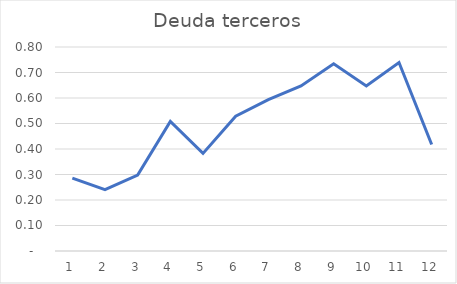
| Category | Series 0 |
|---|---|
| 0 | 0.286 |
| 1 | 0.24 |
| 2 | 0.298 |
| 3 | 0.508 |
| 4 | 0.383 |
| 5 | 0.528 |
| 6 | 0.594 |
| 7 | 0.647 |
| 8 | 0.734 |
| 9 | 0.647 |
| 10 | 0.739 |
| 11 | 0.418 |